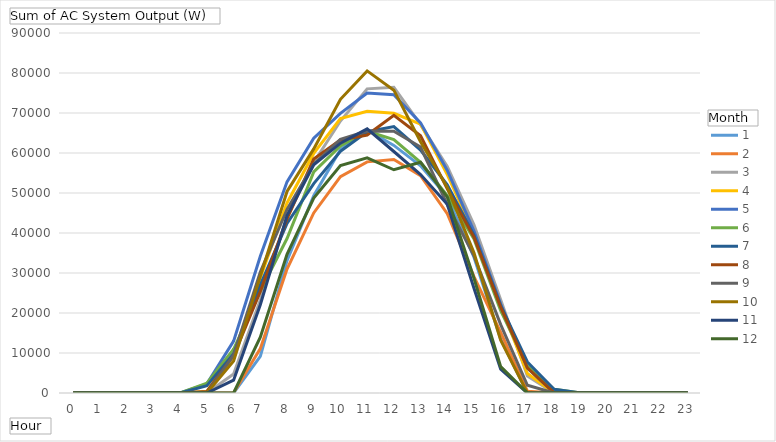
| Category | 1 | 2 | 3 | 4 | 5 | 6 | 7 | 8 | 9 | 10 | 11 | 12 |
|---|---|---|---|---|---|---|---|---|---|---|---|---|
| 0 | 0 | 0 | 0 | 0 | 0 | 0 | 0 | 0 | 0 | 0 | 0 | 0 |
| 1 | 0 | 0 | 0 | 0 | 0 | 0 | 0 | 0 | 0 | 0 | 0 | 0 |
| 2 | 0 | 0 | 0 | 0 | 0 | 0 | 0 | 0 | 0 | 0 | 0 | 0 |
| 3 | 0 | 0 | 0 | 0 | 0 | 0 | 0 | 0 | 0 | 0 | 0 | 0 |
| 4 | 0 | 0 | 0 | 0 | 0 | 0 | 0 | 0 | 0 | 0 | 0 | 0 |
| 5 | 0 | 0 | 0 | 404.015 | 2283.69 | 2476.238 | 1822.856 | 390.086 | 0 | 0 | 0 | 0 |
| 6 | 0 | 82.895 | 4748.291 | 9800.145 | 12976.913 | 10924.944 | 9795.698 | 9338.367 | 9478.911 | 8026.369 | 3194.209 | 0 |
| 7 | 9176.532 | 11099.175 | 23239.365 | 28821.901 | 34192.854 | 25496.818 | 27016.08 | 25369.758 | 30268.324 | 29164.737 | 22069.141 | 13947.428 |
| 8 | 33109.97 | 30966.11 | 43935.992 | 47515.656 | 52786.41 | 38616.293 | 42412.112 | 43516.043 | 45894.364 | 50384.559 | 44374.854 | 34669.165 |
| 9 | 49306.517 | 45021.267 | 57614.293 | 59891.171 | 63698.341 | 55265.193 | 52344.379 | 58495.971 | 57201.583 | 61025.839 | 57053.811 | 48736.101 |
| 10 | 60895.471 | 54070.527 | 67987.553 | 68596.051 | 69900.093 | 61741.646 | 60424.355 | 63259.68 | 63439.203 | 73413.697 | 62464.602 | 56879.359 |
| 11 | 65793.072 | 57789.777 | 76037.044 | 70427.796 | 75009.778 | 65445.249 | 65330.81 | 64488.383 | 65472.2 | 80526.28 | 66042.901 | 58810.73 |
| 12 | 61894.155 | 58387.257 | 76436.878 | 69938.423 | 74562.398 | 63348.95 | 66598.598 | 69427.379 | 65429.116 | 75708.78 | 60379.592 | 55812.754 |
| 13 | 56785.784 | 54334.681 | 67071.811 | 67214.367 | 67536.299 | 57644.287 | 60719.835 | 64291.604 | 61501.594 | 62823.739 | 54604.163 | 57673.353 |
| 14 | 49047.562 | 44812.082 | 56626.463 | 54587.723 | 55625.242 | 49375.262 | 52038.416 | 51025.578 | 47126.403 | 51415.679 | 47176.541 | 49031.18 |
| 15 | 33946.388 | 29085.827 | 42017.671 | 39931.154 | 40509.603 | 38511.196 | 39492.098 | 38942.451 | 34279.628 | 35047.784 | 26171.516 | 28695.107 |
| 16 | 13439.724 | 15135.763 | 23341.191 | 21698.23 | 22234.756 | 20604.008 | 21853.712 | 21464.465 | 17086.269 | 13194.464 | 5970.507 | 6589.954 |
| 17 | 0 | 466.06 | 4259.044 | 4874.932 | 6239.799 | 6772.243 | 7756.711 | 6270.045 | 1926.86 | 0 | 0 | 0 |
| 18 | 0 | 0 | 0 | 0 | 66.708 | 923.697 | 930.435 | 12.02 | 0 | 0 | 0 | 0 |
| 19 | 0 | 0 | 0 | 0 | 0 | 0 | 0 | 0 | 0 | 0 | 0 | 0 |
| 20 | 0 | 0 | 0 | 0 | 0 | 0 | 0 | 0 | 0 | 0 | 0 | 0 |
| 21 | 0 | 0 | 0 | 0 | 0 | 0 | 0 | 0 | 0 | 0 | 0 | 0 |
| 22 | 0 | 0 | 0 | 0 | 0 | 0 | 0 | 0 | 0 | 0 | 0 | 0 |
| 23 | 0 | 0 | 0 | 0 | 0 | 0 | 0 | 0 | 0 | 0 | 0 | 0 |